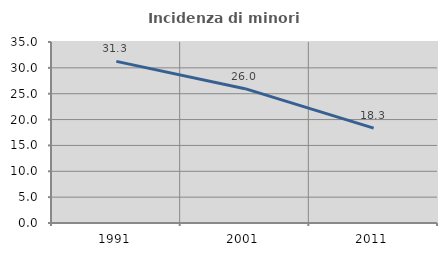
| Category | Incidenza di minori stranieri |
|---|---|
| 1991.0 | 31.25 |
| 2001.0 | 25.974 |
| 2011.0 | 18.349 |